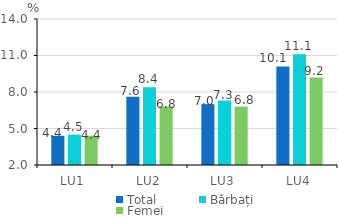
| Category | Total | Bărbați | Femei |
|---|---|---|---|
| LU1 | 4.4 | 4.5 | 4.4 |
| LU2 | 7.6 | 8.4 | 6.8 |
| LU3 | 7 | 7.3 | 6.8 |
| LU4 | 10.1 | 11.1 | 9.2 |